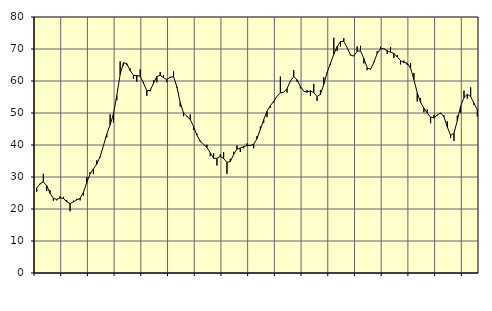
| Category | Piggar | Series 1 |
|---|---|---|
| nan | 25.4 | 26.55 |
| 87.0 | 27.7 | 27.89 |
| 87.0 | 31 | 28.47 |
| 87.0 | 25.6 | 27.33 |
| nan | 25.9 | 24.96 |
| 88.0 | 22.6 | 23.32 |
| 88.0 | 22.7 | 23.01 |
| 88.0 | 24 | 23.46 |
| nan | 23.8 | 23.32 |
| 89.0 | 22.8 | 22.25 |
| 89.0 | 19.3 | 21.71 |
| 89.0 | 22.6 | 22.22 |
| nan | 23.2 | 22.82 |
| 90.0 | 22.7 | 23.35 |
| 90.0 | 24.2 | 25.16 |
| 90.0 | 30 | 28.27 |
| nan | 31.5 | 30.92 |
| 91.0 | 30.9 | 32.52 |
| 91.0 | 35.2 | 34.06 |
| 91.0 | 36.1 | 36.36 |
| nan | 39.8 | 39.75 |
| 92.0 | 42.4 | 43.4 |
| 92.0 | 49.6 | 46.3 |
| 92.0 | 47 | 49.7 |
| nan | 54 | 55.46 |
| 93.0 | 66.1 | 61.99 |
| 93.0 | 64.8 | 65.7 |
| 93.0 | 65 | 65.42 |
| nan | 63.9 | 63.27 |
| 94.0 | 60.7 | 61.79 |
| 94.0 | 59.8 | 61.7 |
| 94.0 | 63.6 | 61.49 |
| nan | 59.7 | 59.33 |
| 95.0 | 55.4 | 56.95 |
| 95.0 | 56.8 | 57.05 |
| 95.0 | 60.3 | 59.3 |
| nan | 59.6 | 61.41 |
| 96.0 | 62.8 | 61.78 |
| 96.0 | 61.8 | 61.01 |
| 96.0 | 59.6 | 60.48 |
| nan | 61 | 61.2 |
| 97.0 | 63 | 61.33 |
| 97.0 | 57.9 | 58.2 |
| 97.0 | 52 | 53.24 |
| nan | 49 | 50 |
| 98.0 | 48.8 | 49 |
| 98.0 | 49.5 | 47.97 |
| 98.0 | 44.7 | 45.81 |
| nan | 43.6 | 43.05 |
| 99.0 | 40.9 | 41.26 |
| 99.0 | 40.1 | 40.22 |
| 99.0 | 40.1 | 39.21 |
| nan | 36.5 | 37.57 |
| 0.0 | 37.5 | 35.85 |
| 0.0 | 33.6 | 35.82 |
| 0.0 | 37.1 | 36.43 |
| nan | 37.8 | 35.82 |
| 1.0 | 31 | 34.57 |
| 1.0 | 35.7 | 34.83 |
| 1.0 | 37.9 | 37.06 |
| nan | 39.9 | 38.7 |
| 2.0 | 37.8 | 39.04 |
| 2.0 | 39 | 39.47 |
| 2.0 | 40.5 | 39.83 |
| nan | 40 | 39.86 |
| 3.0 | 39 | 40.25 |
| 3.0 | 42.8 | 41.96 |
| 3.0 | 45.8 | 44.88 |
| nan | 46.9 | 47.91 |
| 4.0 | 48.7 | 50.49 |
| 4.0 | 51.6 | 52.31 |
| 4.0 | 53.3 | 53.62 |
| nan | 55.3 | 55.26 |
| 5.0 | 61.4 | 56.27 |
| 5.0 | 56.5 | 56.47 |
| 5.0 | 56.4 | 57.62 |
| nan | 59.8 | 59.94 |
| 6.0 | 63.4 | 61.4 |
| 6.0 | 59.7 | 60.4 |
| 6.0 | 57.7 | 58.27 |
| nan | 56.8 | 56.79 |
| 7.0 | 57.2 | 56.5 |
| 7.0 | 55.3 | 56.95 |
| 7.0 | 59.1 | 56.33 |
| nan | 53.8 | 55.16 |
| 8.0 | 57.2 | 55.82 |
| 8.0 | 61.2 | 58.94 |
| 8.0 | 62.4 | 62.63 |
| nan | 65 | 65.54 |
| 9.0 | 73.5 | 68.34 |
| 9.0 | 69.4 | 70.74 |
| 9.0 | 70.8 | 72.35 |
| nan | 73.4 | 72.37 |
| 10.0 | 70.4 | 70.48 |
| 10.0 | 68.3 | 68.09 |
| 10.0 | 67.9 | 67.8 |
| nan | 70.8 | 69.26 |
| 11.0 | 71 | 69.44 |
| 11.0 | 65.5 | 67.04 |
| 11.0 | 63.4 | 64.16 |
| nan | 63.5 | 63.65 |
| 12.0 | 66 | 65.8 |
| 12.0 | 69.3 | 68.61 |
| 12.0 | 70.7 | 70.04 |
| nan | 70.1 | 70.1 |
| 13.0 | 68.5 | 69.46 |
| 13.0 | 70.6 | 69.02 |
| 13.0 | 67.2 | 68.62 |
| nan | 68.1 | 67.55 |
| 14.0 | 65.2 | 66.37 |
| 14.0 | 66.4 | 65.76 |
| 14.0 | 65 | 65.62 |
| nan | 65.6 | 64.03 |
| 15.0 | 62.5 | 60.43 |
| 15.0 | 53.6 | 56.32 |
| 15.0 | 54.7 | 53.32 |
| nan | 50.2 | 51.52 |
| 16.0 | 51.1 | 49.98 |
| 16.0 | 46.8 | 48.68 |
| 16.0 | 49.4 | 48.46 |
| nan | 49.2 | 49.41 |
| 17.0 | 49.7 | 50.01 |
| 17.0 | 49.3 | 48.81 |
| 17.0 | 47.4 | 45.65 |
| nan | 42.2 | 43.02 |
| 18.0 | 41.3 | 43.69 |
| 18.0 | 49.2 | 47.59 |
| 18.0 | 50.1 | 52.13 |
| nan | 57 | 54.83 |
| 19.0 | 54.5 | 55.86 |
| 19.0 | 58 | 55.13 |
| 19.0 | 52.5 | 53.04 |
| nan | 48.9 | 50.94 |